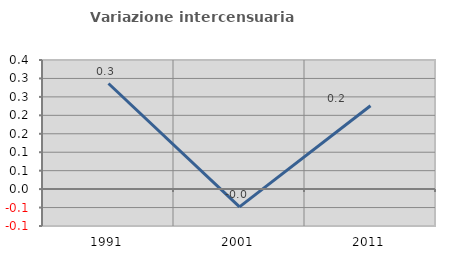
| Category | Variazione intercensuaria annua |
|---|---|
| 1991.0 | 0.286 |
| 2001.0 | -0.048 |
| 2011.0 | 0.226 |